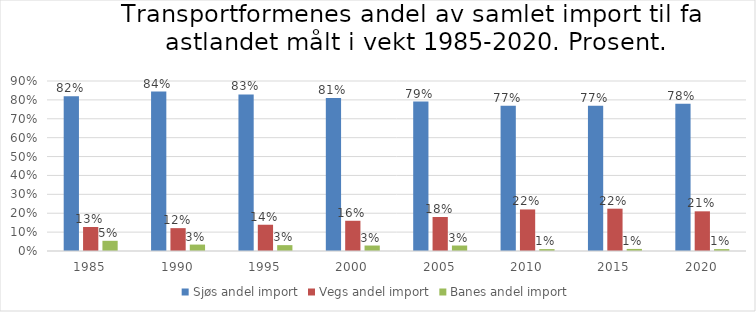
| Category | Sjøs andel import | Vegs andel import | Banes andel import |
|---|---|---|---|
| 1985.0 | 0.819 | 0.127 | 0.054 |
| 1990.0 | 0.844 | 0.121 | 0.034 |
| 1995.0 | 0.829 | 0.139 | 0.031 |
| 2000.0 | 0.81 | 0.16 | 0.029 |
| 2005.0 | 0.791 | 0.18 | 0.029 |
| 2010.0 | 0.769 | 0.22 | 0.01 |
| 2015.0 | 0.769 | 0.224 | 0.011 |
| 2020.0 | 0.78 | 0.21 | 0.01 |